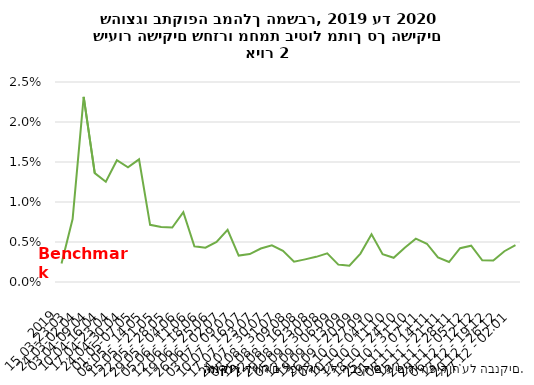
| Category | חוזר מחמת ביטול |
|---|---|
| 2019 | 0.002 |
| 15.03-23.03 | 0.008 |
| 24.03-02.04 | 0.023 |
| 03.04-09.04 | 0.014 |
| 10.04-16.04 | 0.013 |
| 17.04-23.04 | 0.015 |
| 24.04-30.04 | 0.014 |
| 01.05-07.05 | 0.015 |
| 08.05 - 14.05 | 0.007 |
| 15.05 - 21.05 | 0.007 |
| 22.05 - 28.05 | 0.007 |
| 29.05 - 04.06 | 0.009 |
| 05.06 - 11.06 | 0.004 |
| 12.06 - 18.06 | 0.004 |
| 19.06 - 25.06 | 0.005 |
| 26.06 - 02.07 | 0.007 |
| 03.07 - 09.07 | 0.003 |
| 10.07 - 16.07 | 0.003 |
| 17.07 - 23.07 | 0.004 |
| 24.07 - 30.07 | 0.005 |
| 08.08 - 31.07 | 0.004 |
| 15.08 - 09.08 | 0.003 |
| 22.08 - 16.08 | 0.003 |
| 29.08 - 23.08 | 0.003 |
| 05.09 - 30.08 | 0.004 |
| 12.09 - 06.09 | 0.002 |
| 19.09 - 13.09 | 0.002 |
| 26.09 - 20.09 | 0.004 |
| 03.10 - 27.09 | 0.006 |
| 10.10 - 04.10 | 0.003 |
| 17.10 - 11.10 | 0.003 |
| 18.10 - 24.10 | 0.004 |
| 25.10 - 31.10 | 0.005 |
| 01.11 - 07.11 | 0.005 |
| 08.11 - 14.11 | 0.003 |
| 15.11 - 21.11 | 0.002 |
| 22.11 - 28.11 | 0.004 |
| 29.11 - 05.12 | 0.005 |
| 06.12 - 12.12 | 0.003 |
| 13.12 - 19.12 | 0.003 |
| 20.12 - 26.12 | 0.004 |
| 27.12 - 02.01 | 0.005 |